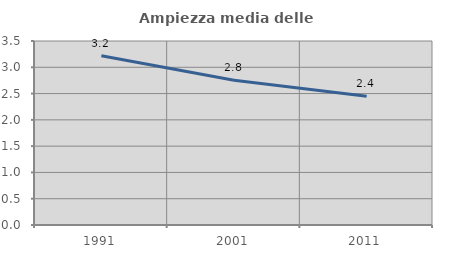
| Category | Ampiezza media delle famiglie |
|---|---|
| 1991.0 | 3.221 |
| 2001.0 | 2.755 |
| 2011.0 | 2.448 |